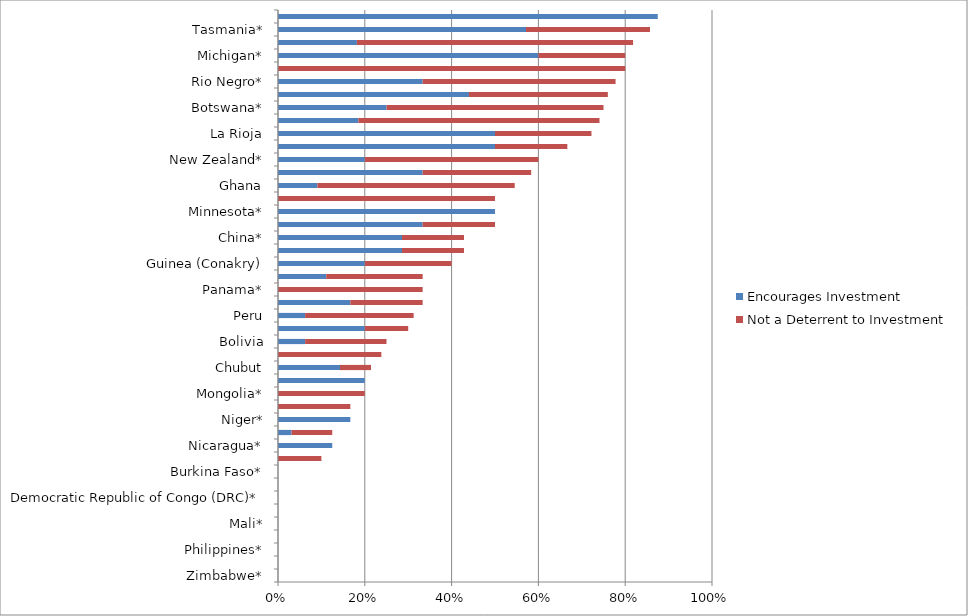
| Category | Encourages Investment | Not a Deterrent to Investment |
|---|---|---|
| Zimbabwe* | 0 | 0 |
| Venezuela* | 0 | 0 |
| Philippines* | 0 | 0 |
| Papua New Guinea | 0 | 0 |
| Mali* | 0 | 0 |
| Liberia* | 0 | 0 |
| Democratic Republic of Congo (DRC)* | 0 | 0 |
| Colombia | 0 | 0 |
| Burkina Faso* | 0 | 0 |
| South Africa | 0 | 0.1 |
| Nicaragua* | 0.125 | 0 |
| Mexico | 0.031 | 0.094 |
| Niger* | 0.167 | 0 |
| Indonesia | 0 | 0.167 |
| Mongolia* | 0 | 0.2 |
| Kyrgyzstan* | 0.2 | 0 |
| Chubut | 0.143 | 0.071 |
| Brazil | 0 | 0.238 |
| Bolivia | 0.062 | 0.188 |
| Turkey | 0.2 | 0.1 |
| Peru | 0.062 | 0.25 |
| Tanzania* | 0.167 | 0.167 |
| Panama* | 0 | 0.333 |
| Mendoza* | 0.111 | 0.222 |
| Guinea (Conakry) | 0.2 | 0.2 |
| Mauritania* | 0.286 | 0.143 |
| China* | 0.286 | 0.143 |
| Russia* | 0.333 | 0.167 |
| Minnesota* | 0.5 | 0 |
| Guyana* | 0 | 0.5 |
| Ghana | 0.091 | 0.455 |
| Kazakhstan | 0.333 | 0.25 |
| New Zealand* | 0.2 | 0.4 |
| Senegal* | 0.5 | 0.167 |
| La Rioja | 0.5 | 0.222 |
| Chile | 0.185 | 0.556 |
| Botswana* | 0.25 | 0.5 |
| San Juan | 0.44 | 0.32 |
| Rio Negro* | 0.333 | 0.444 |
| Spain* | 0 | 0.8 |
| Michigan* | 0.6 | 0.2 |
| Ecuador | 0.182 | 0.636 |
| Tasmania* | 0.571 | 0.286 |
| Northern Ireland* | 0.875 | 0 |